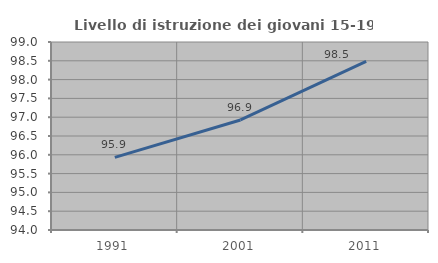
| Category | Livello di istruzione dei giovani 15-19 anni |
|---|---|
| 1991.0 | 95.932 |
| 2001.0 | 96.927 |
| 2011.0 | 98.485 |